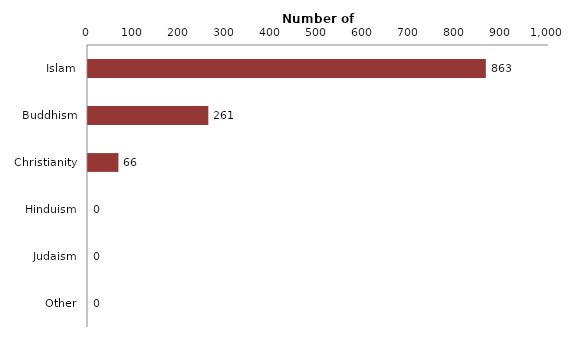
| Category | Series 0 |
|---|---|
| Islam | 863 |
| Buddhism | 261 |
| Christianity | 66 |
| Hinduism | 0 |
| Judaism | 0 |
| Other | 0 |